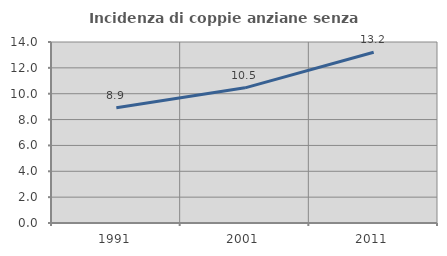
| Category | Incidenza di coppie anziane senza figli  |
|---|---|
| 1991.0 | 8.913 |
| 2001.0 | 10.454 |
| 2011.0 | 13.208 |